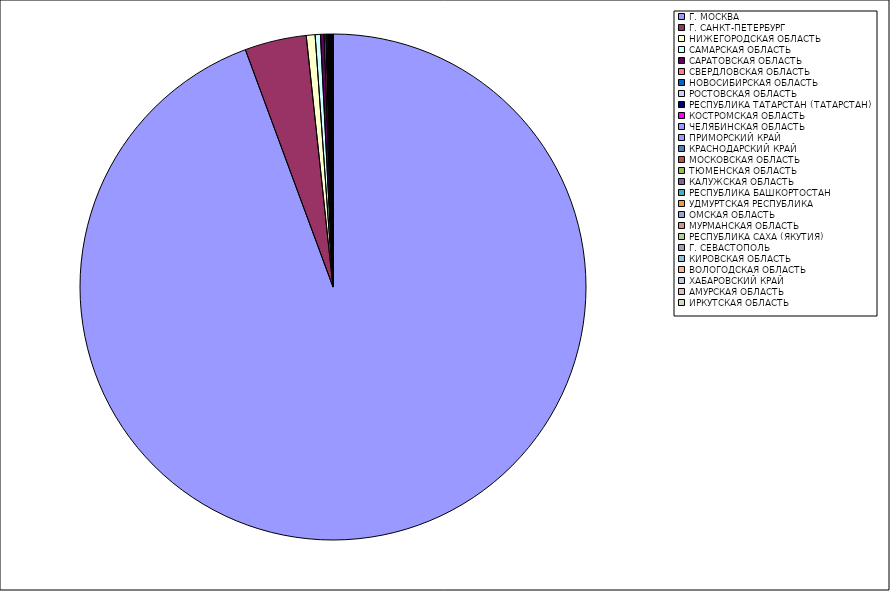
| Category | Оборот |
|---|---|
| Г. МОСКВА | 94.326 |
| Г. САНКТ-ПЕТЕРБУРГ | 3.938 |
| НИЖЕГОРОДСКАЯ ОБЛАСТЬ | 0.562 |
| САМАРСКАЯ ОБЛАСТЬ | 0.336 |
| САРАТОВСКАЯ ОБЛАСТЬ | 0.232 |
| СВЕРДЛОВСКАЯ ОБЛАСТЬ | 0.109 |
| НОВОСИБИРСКАЯ ОБЛАСТЬ | 0.064 |
| РОСТОВСКАЯ ОБЛАСТЬ | 0.06 |
| РЕСПУБЛИКА ТАТАРСТАН (ТАТАРСТАН) | 0.045 |
| КОСТРОМСКАЯ ОБЛАСТЬ | 0.031 |
| ЧЕЛЯБИНСКАЯ ОБЛАСТЬ | 0.03 |
| ПРИМОРСКИЙ КРАЙ | 0.027 |
| КРАСНОДАРСКИЙ КРАЙ | 0.024 |
| МОСКОВСКАЯ ОБЛАСТЬ | 0.021 |
| ТЮМЕНСКАЯ ОБЛАСТЬ | 0.019 |
| КАЛУЖСКАЯ ОБЛАСТЬ | 0.018 |
| РЕСПУБЛИКА БАШКОРТОСТАН | 0.014 |
| УДМУРТСКАЯ РЕСПУБЛИКА | 0.013 |
| ОМСКАЯ ОБЛАСТЬ | 0.013 |
| МУРМАНСКАЯ ОБЛАСТЬ | 0.012 |
| РЕСПУБЛИКА САХА (ЯКУТИЯ) | 0.011 |
| Г. СЕВАСТОПОЛЬ | 0.01 |
| КИРОВСКАЯ ОБЛАСТЬ | 0.01 |
| ВОЛОГОДСКАЯ ОБЛАСТЬ | 0.009 |
| ХАБАРОВСКИЙ КРАЙ | 0.008 |
| АМУРСКАЯ ОБЛАСТЬ | 0.008 |
| ИРКУТСКАЯ ОБЛАСТЬ | 0.006 |